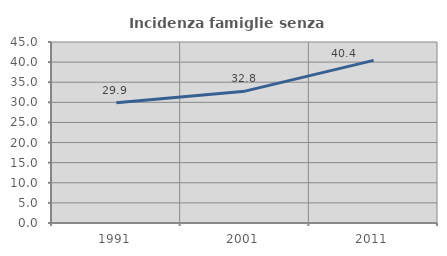
| Category | Incidenza famiglie senza nuclei |
|---|---|
| 1991.0 | 29.915 |
| 2001.0 | 32.78 |
| 2011.0 | 40.439 |